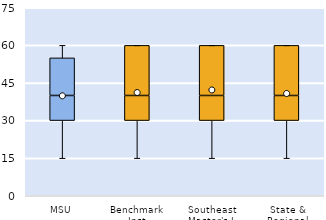
| Category | 25th | 50th | 75th |
|---|---|---|---|
| MSU | 30 | 10 | 15 |
| Benchmark Inst | 30 | 10 | 20 |
| Southeast Master's-L | 30 | 10 | 20 |
| State & Regional | 30 | 10 | 20 |